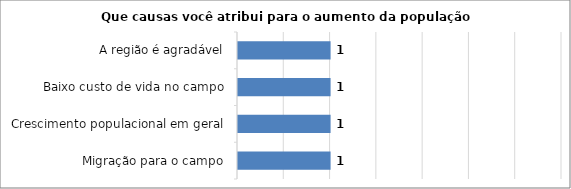
| Category | Series 0 |
|---|---|
| Migração para o campo | 1 |
| Crescimento populacional em geral | 1 |
| Baixo custo de vida no campo | 1 |
| A região é agradável | 1 |